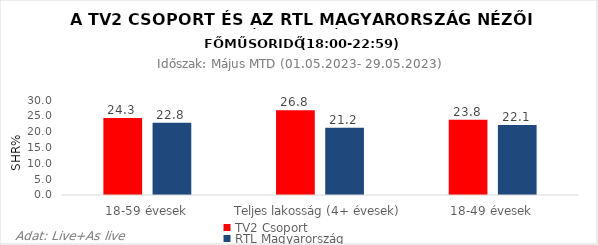
| Category | TV2 Csoport | RTL Magyarország |
|---|---|---|
| 18-59 évesek | 24.3 | 22.8 |
| Teljes lakosság (4+ évesek) | 26.8 | 21.2 |
| 18-49 évesek | 23.8 | 22.1 |